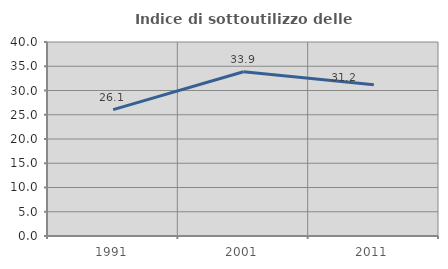
| Category | Indice di sottoutilizzo delle abitazioni  |
|---|---|
| 1991.0 | 26.058 |
| 2001.0 | 33.867 |
| 2011.0 | 31.201 |